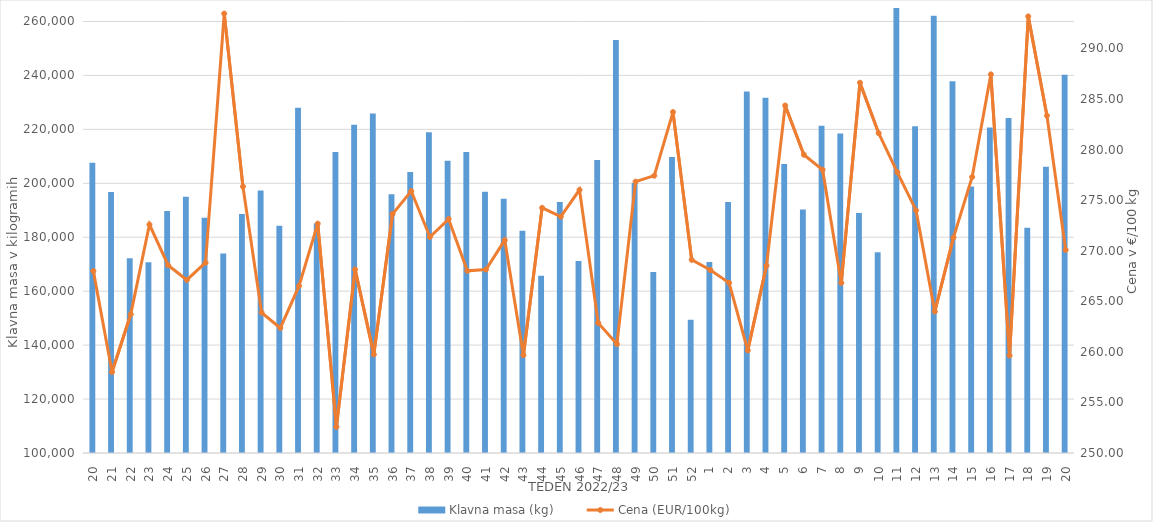
| Category | Klavna masa (kg) |
|---|---|
| 20.0 | 207661 |
| 21.0 | 196732 |
| 22.0 | 172190 |
| 23.0 | 170751 |
| 24.0 | 189775 |
| 25.0 | 195029 |
| 26.0 | 187239 |
| 27.0 | 173967 |
| 28.0 | 188601 |
| 29.0 | 197293 |
| 30.0 | 184259 |
| 31.0 | 228023 |
| 32.0 | 185079 |
| 33.0 | 211612 |
| 34.0 | 221748 |
| 35.0 | 225927 |
| 36.0 | 195924 |
| 37.0 | 204224 |
| 38.0 | 218966 |
| 39.0 | 208403 |
| 40.0 | 211635 |
| 41.0 | 196841 |
| 42.0 | 194271 |
| 43.0 | 182399 |
| 44.0 | 165696 |
| 45.0 | 193022 |
| 46.0 | 171172 |
| 47.0 | 208597 |
| 48.0 | 253151 |
| 49.0 | 200117 |
| 50.0 | 167119 |
| 51.0 | 209797 |
| 52.0 | 149439 |
| 1.0 | 170843 |
| 2.0 | 193093 |
| 3.0 | 234042 |
| 4.0 | 231737 |
| 5.0 | 207136 |
| 6.0 | 190311 |
| 7.0 | 221366 |
| 8.0 | 218470 |
| 9.0 | 189006 |
| 10.0 | 174425 |
| 11.0 | 265476 |
| 12.0 | 221171 |
| 13.0 | 262102 |
| 14.0 | 237813 |
| 15.0 | 198828 |
| 16.0 | 220686 |
| 17.0 | 224192 |
| 18.0 | 183508 |
| 19.0 | 206133 |
| 20.0 | 240223 |